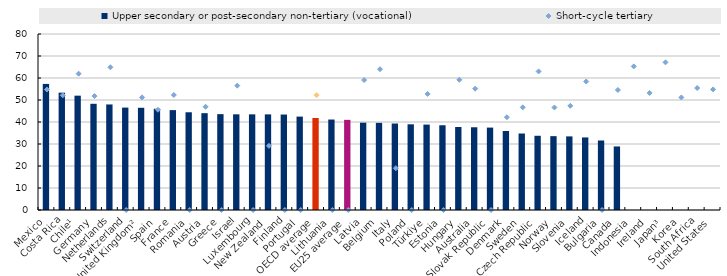
| Category | Upper secondary or post-secondary non-tertiary (vocational) |
|---|---|
| Mexico | 57.312 |
| Costa Rica | 53.33 |
| Chile¹ | 51.974 |
| Germany | 48.275 |
| Netherlands | 47.973 |
| Switzerland | 46.544 |
| United Kingdom² | 46.463 |
| Spain | 46.022 |
| France | 45.406 |
| Romania | 44.423 |
| Austria | 44.012 |
| Greece | 43.578 |
| Israel | 43.488 |
| Luxembourg | 43.478 |
| New Zealand | 43.463 |
| Finland | 43.396 |
| Portugal | 42.458 |
| OECD average | 41.822 |
| Lithuania | 41.124 |
| EU25 average | 40.98 |
| Latvia | 39.696 |
| Belgium | 39.61 |
| Italy | 39.311 |
| Poland | 38.952 |
| Türkiye | 38.822 |
| Estonia | 38.522 |
| Hungary | 37.725 |
| Australia | 37.607 |
| Slovak Republic | 37.459 |
| Denmark | 35.907 |
| Sweden | 34.771 |
| Czech Republic | 33.74 |
| Norway | 33.571 |
| Slovenia | 33.459 |
| Iceland | 32.983 |
| Bulgaria | 31.599 |
| Canada | 28.889 |
| Indonesia | 0 |
| Ireland | 0 |
| Japan³ | 0 |
| Korea | 0 |
| South Africa | 0 |
| United States | 0 |